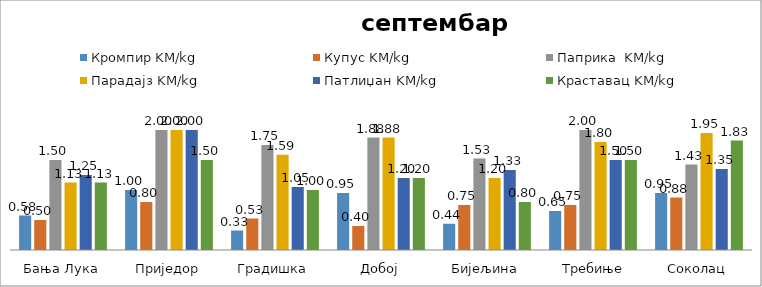
| Category | Кромпир KM/kg | Купус KM/kg | Паприка  KM/kg | Парадајз KM/kg | Патлиџан KM/kg | Краставац KM/kg |
|---|---|---|---|---|---|---|
| Бања Лука | 0.575 | 0.5 | 1.5 | 1.125 | 1.25 | 1.125 |
| Приједор | 1 | 0.8 | 2 | 2 | 2 | 1.5 |
| Градишка | 0.325 | 0.525 | 1.75 | 1.588 | 1.05 | 1 |
| Добој | 0.95 | 0.4 | 1.875 | 1.875 | 1.2 | 1.2 |
| Бијељина | 0.438 | 0.75 | 1.525 | 1.2 | 1.333 | 0.8 |
|  Требиње | 0.65 | 0.75 | 2 | 1.8 | 1.5 | 1.5 |
| Соколац | 0.95 | 0.875 | 1.425 | 1.95 | 1.35 | 1.825 |